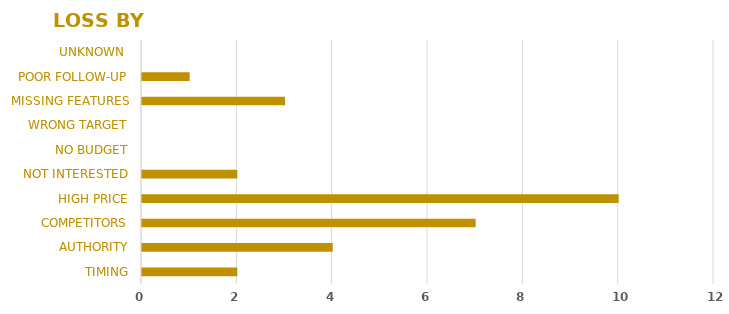
| Category | Series 0 |
|---|---|
| TIMING | 2 |
| AUTHORITY | 4 |
| COMPETITORS | 7 |
| HIGH PRICE | 10 |
| NOT INTERESTED | 2 |
| NO BUDGET | 0 |
| WRONG TARGET | 0 |
| MISSING FEATURES | 3 |
| POOR FOLLOW-UP | 1 |
| UNKNOWN  | 0 |